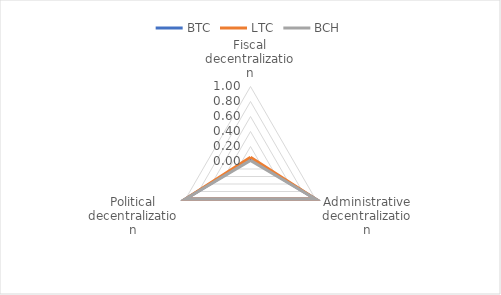
| Category | BTC | LTC | BCH |
|---|---|---|---|
| Fiscal decentralization | 0.029 | 0.056 | 0.015 |
| Administrative decentralization | 1 | 1 | 1 |
| Political decentralization | 1 | 1 | 1 |